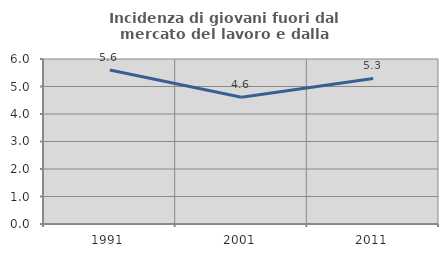
| Category | Incidenza di giovani fuori dal mercato del lavoro e dalla formazione  |
|---|---|
| 1991.0 | 5.598 |
| 2001.0 | 4.61 |
| 2011.0 | 5.291 |